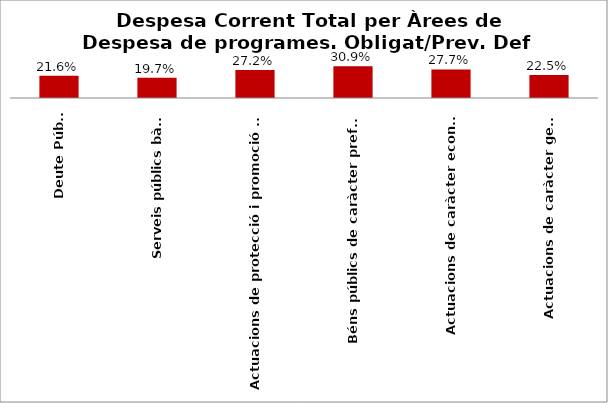
| Category | Series 0 |
|---|---|
| Deute Públic | 0.216 |
| Serveis públics bàsics | 0.197 |
| Actuacions de protecció i promoció social | 0.272 |
| Béns públics de caràcter preferent | 0.309 |
| Actuacions de caràcter econòmic | 0.277 |
| Actuacions de caràcter general | 0.225 |